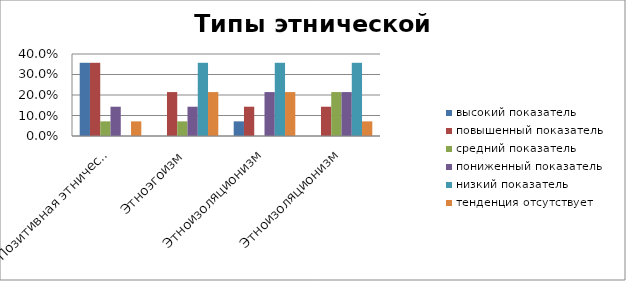
| Category | высокий показатель | повышенный показатель | средний показатель | пониженный показатель | низкий показатель | тенденция отсутствует |
|---|---|---|---|---|---|---|
| Позитивная этническая идентичность | 0.357 | 0.357 | 0.071 | 0.143 | 0 | 0.071 |
| Этноэгоизм | 0 | 0.214 | 0.071 | 0.143 | 0.357 | 0.214 |
| Этноизоляционизм | 0.071 | 0.143 | 0 | 0.214 | 0.357 | 0.214 |
| Этноизоляционизм | 0 | 0.143 | 0.214 | 0.214 | 0.357 | 0.071 |